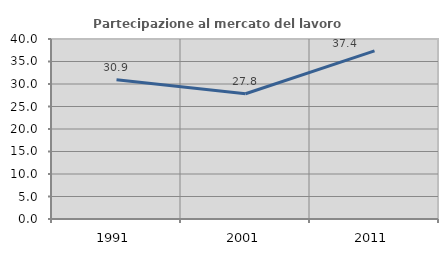
| Category | Partecipazione al mercato del lavoro  femminile |
|---|---|
| 1991.0 | 30.928 |
| 2001.0 | 27.832 |
| 2011.0 | 37.351 |